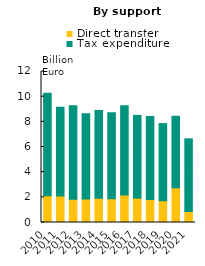
| Category | Direct transfer | Tax expenditure |
|---|---|---|
| 2010 | 2119.922 | 8153.086 |
| 2011 | 2101.094 | 7060.805 |
| 2012 | 1854.006 | 7418.58 |
| 2013 | 1868.766 | 6764.289 |
| 2014 | 1924.487 | 6982.621 |
| 2015 | 1882.279 | 6832.726 |
| 2016 | 2194.094 | 7090.889 |
| 2017 | 1936.537 | 6574.044 |
| 2018 | 1818.625 | 6613.667 |
| 2019 | 1732.736 | 6127.179 |
| 2020 | 2756.166 | 5686.383 |
| 2021 | 872.066 | 5775.658 |